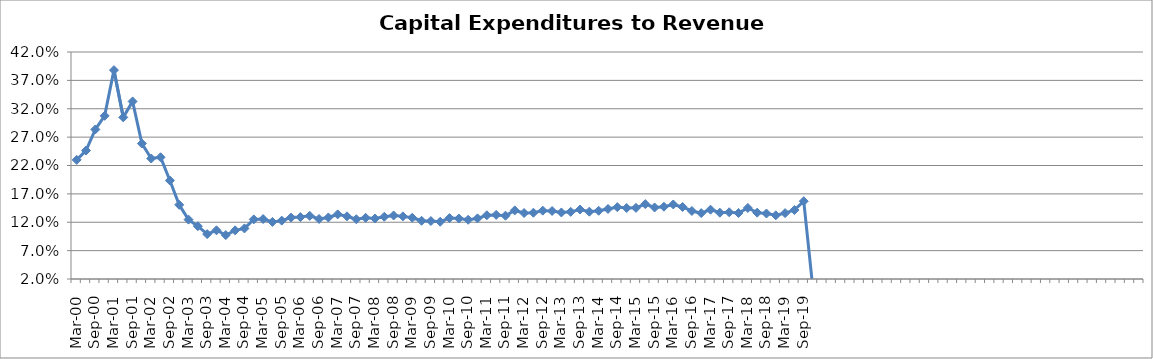
| Category | Series 0 |
|---|---|
| Mar-00 | 0.23 |
| Jun-00 | 0.246 |
| Sep-00 | 0.284 |
| Dec-00 | 0.308 |
| Mar-01 | 0.388 |
| Jun-01 | 0.305 |
| Sep-01 | 0.333 |
| Dec-01 | 0.259 |
| Mar-02 | 0.232 |
| Jun-02 | 0.235 |
| Sep-02 | 0.194 |
| Dec-02 | 0.151 |
| Mar-03 | 0.125 |
| Jun-03 | 0.113 |
| Sep-03 | 0.099 |
| Dec-03 | 0.106 |
| Mar-04 | 0.097 |
| Jun-04 | 0.106 |
| Sep-04 | 0.109 |
| Dec-04 | 0.125 |
| Mar-05 | 0.126 |
| Jun-05 | 0.121 |
| Sep-05 | 0.123 |
| Dec-05 | 0.128 |
| Mar-06 | 0.129 |
| Jun-06 | 0.131 |
| Sep-06 | 0.126 |
| Dec-06 | 0.128 |
| Mar-07 | 0.134 |
| Jun-07 | 0.13 |
| Sep-07 | 0.125 |
| Dec-07 | 0.128 |
| Mar-08 | 0.127 |
| Jun-08 | 0.13 |
| Sep-08 | 0.132 |
| Dec-08 | 0.13 |
| Mar-09 | 0.128 |
| Jun-09 | 0.123 |
| Sep-09 | 0.122 |
| Dec-09 | 0.121 |
| Mar-10 | 0.127 |
| Jun-10 | 0.127 |
| Sep-10 | 0.124 |
| Dec-10 | 0.127 |
| Mar-11 | 0.132 |
| Jun-11 | 0.133 |
| Sep-11 | 0.132 |
| Dec-11 | 0.141 |
| Mar-12 | 0.136 |
| Jun-12 | 0.137 |
| Sep-12 | 0.14 |
| Dec-12 | 0.14 |
| Mar-13 | 0.137 |
| Jun-13 | 0.138 |
| Sep-13 | 0.142 |
| Dec-13 | 0.139 |
| Mar-14 | 0.14 |
| Jun-14 | 0.143 |
| Sep-14 | 0.147 |
| Dec-14 | 0.145 |
| Mar-15 | 0.145 |
| Jun-15 | 0.152 |
| Sep-15 | 0.146 |
| Dec-15 | 0.147 |
| Mar-16 | 0.151 |
| Jun-16 | 0.147 |
| Sep-16 | 0.14 |
| Dec-16 | 0.136 |
| Mar-17 | 0.142 |
| Jun-17 | 0.137 |
| Sep-17 | 0.138 |
| Dec-17 | 0.136 |
| Mar-18 | 0.145 |
| Jun-18 | 0.137 |
| Sep-18 | 0.135 |
| Dec-18 | 0.132 |
| Mar-19 | 0.136 |
| Jun-19 | 0.142 |
| Sep-19 | 0.157 |